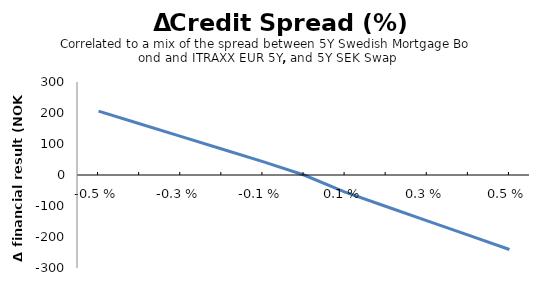
| Category | Series 0 |
|---|---|
| -0.005 | 205.971 |
| -0.004 | 165.228 |
| -0.003 | 124.485 |
| -0.002 | 83.742 |
| -0.001 | 42.999 |
| 0.0 | 0 |
| 0.001 | -55.323 |
| 0.002 | -101.558 |
| 0.003 | -147.792 |
| 0.004 | -194.027 |
| 0.005 | -240.261 |